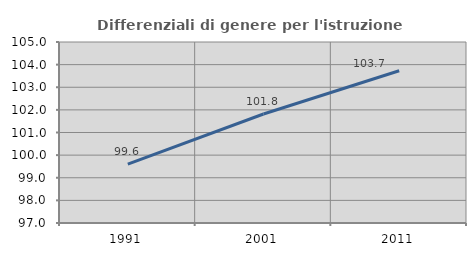
| Category | Differenziali di genere per l'istruzione superiore |
|---|---|
| 1991.0 | 99.602 |
| 2001.0 | 101.818 |
| 2011.0 | 103.727 |